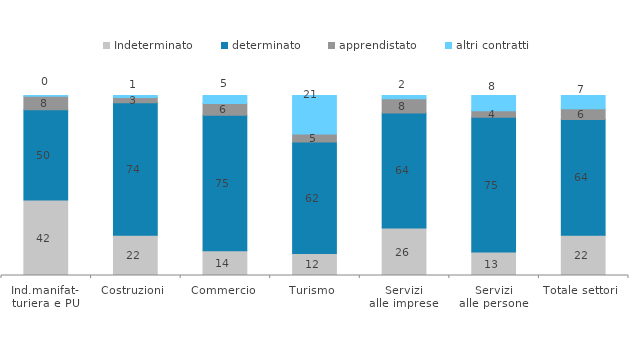
| Category | Indeterminato | determinato | apprendistato | altri contratti |
|---|---|---|---|---|
| Ind.manifat-
turiera e PU | 41.987 | 50.035 | 7.558 | 0.42 |
| Costruzioni | 22.394 | 73.552 | 2.896 | 1.158 |
| Commercio | 13.796 | 75.293 | 6.402 | 4.509 |
| Turismo | 12.255 | 61.91 | 4.509 | 21.326 |
| Servizi
alle imprese | 26.402 | 63.871 | 7.94 | 1.787 |
| Servizi
alle persone | 13.043 | 74.879 | 3.623 | 8.454 |
| Totale settori | 22.354 | 64.299 | 6.025 | 7.323 |